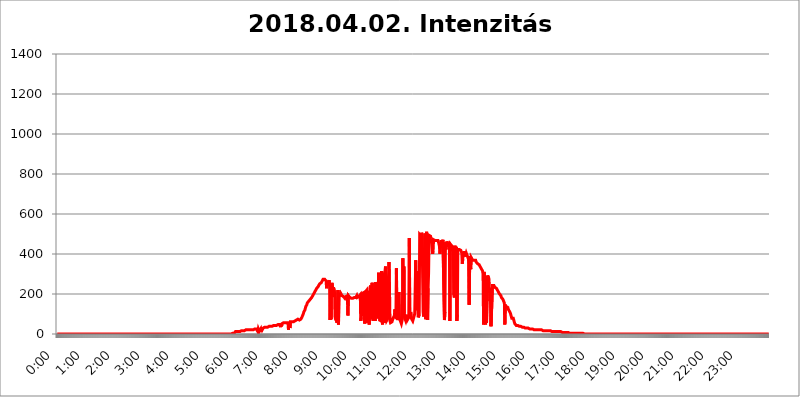
| Category | 2018.04.02. Intenzitás [W/m^2] |
|---|---|
| 0.0 | 0 |
| 0.0006944444444444445 | 0 |
| 0.001388888888888889 | 0 |
| 0.0020833333333333333 | 0 |
| 0.002777777777777778 | 0 |
| 0.003472222222222222 | 0 |
| 0.004166666666666667 | 0 |
| 0.004861111111111111 | 0 |
| 0.005555555555555556 | 0 |
| 0.0062499999999999995 | 0 |
| 0.006944444444444444 | 0 |
| 0.007638888888888889 | 0 |
| 0.008333333333333333 | 0 |
| 0.009027777777777779 | 0 |
| 0.009722222222222222 | 0 |
| 0.010416666666666666 | 0 |
| 0.011111111111111112 | 0 |
| 0.011805555555555555 | 0 |
| 0.012499999999999999 | 0 |
| 0.013194444444444444 | 0 |
| 0.013888888888888888 | 0 |
| 0.014583333333333332 | 0 |
| 0.015277777777777777 | 0 |
| 0.015972222222222224 | 0 |
| 0.016666666666666666 | 0 |
| 0.017361111111111112 | 0 |
| 0.018055555555555557 | 0 |
| 0.01875 | 0 |
| 0.019444444444444445 | 0 |
| 0.02013888888888889 | 0 |
| 0.020833333333333332 | 0 |
| 0.02152777777777778 | 0 |
| 0.022222222222222223 | 0 |
| 0.02291666666666667 | 0 |
| 0.02361111111111111 | 0 |
| 0.024305555555555556 | 0 |
| 0.024999999999999998 | 0 |
| 0.025694444444444447 | 0 |
| 0.02638888888888889 | 0 |
| 0.027083333333333334 | 0 |
| 0.027777777777777776 | 0 |
| 0.02847222222222222 | 0 |
| 0.029166666666666664 | 0 |
| 0.029861111111111113 | 0 |
| 0.030555555555555555 | 0 |
| 0.03125 | 0 |
| 0.03194444444444445 | 0 |
| 0.03263888888888889 | 0 |
| 0.03333333333333333 | 0 |
| 0.034027777777777775 | 0 |
| 0.034722222222222224 | 0 |
| 0.035416666666666666 | 0 |
| 0.036111111111111115 | 0 |
| 0.03680555555555556 | 0 |
| 0.0375 | 0 |
| 0.03819444444444444 | 0 |
| 0.03888888888888889 | 0 |
| 0.03958333333333333 | 0 |
| 0.04027777777777778 | 0 |
| 0.04097222222222222 | 0 |
| 0.041666666666666664 | 0 |
| 0.042361111111111106 | 0 |
| 0.04305555555555556 | 0 |
| 0.043750000000000004 | 0 |
| 0.044444444444444446 | 0 |
| 0.04513888888888889 | 0 |
| 0.04583333333333334 | 0 |
| 0.04652777777777778 | 0 |
| 0.04722222222222222 | 0 |
| 0.04791666666666666 | 0 |
| 0.04861111111111111 | 0 |
| 0.049305555555555554 | 0 |
| 0.049999999999999996 | 0 |
| 0.05069444444444445 | 0 |
| 0.051388888888888894 | 0 |
| 0.052083333333333336 | 0 |
| 0.05277777777777778 | 0 |
| 0.05347222222222222 | 0 |
| 0.05416666666666667 | 0 |
| 0.05486111111111111 | 0 |
| 0.05555555555555555 | 0 |
| 0.05625 | 0 |
| 0.05694444444444444 | 0 |
| 0.057638888888888885 | 0 |
| 0.05833333333333333 | 0 |
| 0.05902777777777778 | 0 |
| 0.059722222222222225 | 0 |
| 0.06041666666666667 | 0 |
| 0.061111111111111116 | 0 |
| 0.06180555555555556 | 0 |
| 0.0625 | 0 |
| 0.06319444444444444 | 0 |
| 0.06388888888888888 | 0 |
| 0.06458333333333334 | 0 |
| 0.06527777777777778 | 0 |
| 0.06597222222222222 | 0 |
| 0.06666666666666667 | 0 |
| 0.06736111111111111 | 0 |
| 0.06805555555555555 | 0 |
| 0.06874999999999999 | 0 |
| 0.06944444444444443 | 0 |
| 0.07013888888888889 | 0 |
| 0.07083333333333333 | 0 |
| 0.07152777777777779 | 0 |
| 0.07222222222222223 | 0 |
| 0.07291666666666667 | 0 |
| 0.07361111111111111 | 0 |
| 0.07430555555555556 | 0 |
| 0.075 | 0 |
| 0.07569444444444444 | 0 |
| 0.0763888888888889 | 0 |
| 0.07708333333333334 | 0 |
| 0.07777777777777778 | 0 |
| 0.07847222222222222 | 0 |
| 0.07916666666666666 | 0 |
| 0.0798611111111111 | 0 |
| 0.08055555555555556 | 0 |
| 0.08125 | 0 |
| 0.08194444444444444 | 0 |
| 0.08263888888888889 | 0 |
| 0.08333333333333333 | 0 |
| 0.08402777777777777 | 0 |
| 0.08472222222222221 | 0 |
| 0.08541666666666665 | 0 |
| 0.08611111111111112 | 0 |
| 0.08680555555555557 | 0 |
| 0.08750000000000001 | 0 |
| 0.08819444444444445 | 0 |
| 0.08888888888888889 | 0 |
| 0.08958333333333333 | 0 |
| 0.09027777777777778 | 0 |
| 0.09097222222222222 | 0 |
| 0.09166666666666667 | 0 |
| 0.09236111111111112 | 0 |
| 0.09305555555555556 | 0 |
| 0.09375 | 0 |
| 0.09444444444444444 | 0 |
| 0.09513888888888888 | 0 |
| 0.09583333333333333 | 0 |
| 0.09652777777777777 | 0 |
| 0.09722222222222222 | 0 |
| 0.09791666666666667 | 0 |
| 0.09861111111111111 | 0 |
| 0.09930555555555555 | 0 |
| 0.09999999999999999 | 0 |
| 0.10069444444444443 | 0 |
| 0.1013888888888889 | 0 |
| 0.10208333333333335 | 0 |
| 0.10277777777777779 | 0 |
| 0.10347222222222223 | 0 |
| 0.10416666666666667 | 0 |
| 0.10486111111111111 | 0 |
| 0.10555555555555556 | 0 |
| 0.10625 | 0 |
| 0.10694444444444444 | 0 |
| 0.1076388888888889 | 0 |
| 0.10833333333333334 | 0 |
| 0.10902777777777778 | 0 |
| 0.10972222222222222 | 0 |
| 0.1111111111111111 | 0 |
| 0.11180555555555556 | 0 |
| 0.11180555555555556 | 0 |
| 0.1125 | 0 |
| 0.11319444444444444 | 0 |
| 0.11388888888888889 | 0 |
| 0.11458333333333333 | 0 |
| 0.11527777777777777 | 0 |
| 0.11597222222222221 | 0 |
| 0.11666666666666665 | 0 |
| 0.1173611111111111 | 0 |
| 0.11805555555555557 | 0 |
| 0.11944444444444445 | 0 |
| 0.12013888888888889 | 0 |
| 0.12083333333333333 | 0 |
| 0.12152777777777778 | 0 |
| 0.12222222222222223 | 0 |
| 0.12291666666666667 | 0 |
| 0.12291666666666667 | 0 |
| 0.12361111111111112 | 0 |
| 0.12430555555555556 | 0 |
| 0.125 | 0 |
| 0.12569444444444444 | 0 |
| 0.12638888888888888 | 0 |
| 0.12708333333333333 | 0 |
| 0.16875 | 0 |
| 0.12847222222222224 | 0 |
| 0.12916666666666668 | 0 |
| 0.12986111111111112 | 0 |
| 0.13055555555555556 | 0 |
| 0.13125 | 0 |
| 0.13194444444444445 | 0 |
| 0.1326388888888889 | 0 |
| 0.13333333333333333 | 0 |
| 0.13402777777777777 | 0 |
| 0.13402777777777777 | 0 |
| 0.13472222222222222 | 0 |
| 0.13541666666666666 | 0 |
| 0.1361111111111111 | 0 |
| 0.13749999999999998 | 0 |
| 0.13819444444444443 | 0 |
| 0.1388888888888889 | 0 |
| 0.13958333333333334 | 0 |
| 0.14027777777777778 | 0 |
| 0.14097222222222222 | 0 |
| 0.14166666666666666 | 0 |
| 0.1423611111111111 | 0 |
| 0.14305555555555557 | 0 |
| 0.14375000000000002 | 0 |
| 0.14444444444444446 | 0 |
| 0.1451388888888889 | 0 |
| 0.1451388888888889 | 0 |
| 0.14652777777777778 | 0 |
| 0.14722222222222223 | 0 |
| 0.14791666666666667 | 0 |
| 0.1486111111111111 | 0 |
| 0.14930555555555555 | 0 |
| 0.15 | 0 |
| 0.15069444444444444 | 0 |
| 0.15138888888888888 | 0 |
| 0.15208333333333332 | 0 |
| 0.15277777777777776 | 0 |
| 0.15347222222222223 | 0 |
| 0.15416666666666667 | 0 |
| 0.15486111111111112 | 0 |
| 0.15555555555555556 | 0 |
| 0.15625 | 0 |
| 0.15694444444444444 | 0 |
| 0.15763888888888888 | 0 |
| 0.15833333333333333 | 0 |
| 0.15902777777777777 | 0 |
| 0.15972222222222224 | 0 |
| 0.16041666666666668 | 0 |
| 0.16111111111111112 | 0 |
| 0.16180555555555556 | 0 |
| 0.1625 | 0 |
| 0.16319444444444445 | 0 |
| 0.1638888888888889 | 0 |
| 0.16458333333333333 | 0 |
| 0.16527777777777777 | 0 |
| 0.16597222222222222 | 0 |
| 0.16666666666666666 | 0 |
| 0.1673611111111111 | 0 |
| 0.16805555555555554 | 0 |
| 0.16874999999999998 | 0 |
| 0.16944444444444443 | 0 |
| 0.17013888888888887 | 0 |
| 0.1708333333333333 | 0 |
| 0.17152777777777775 | 0 |
| 0.17222222222222225 | 0 |
| 0.1729166666666667 | 0 |
| 0.17361111111111113 | 0 |
| 0.17430555555555557 | 0 |
| 0.17500000000000002 | 0 |
| 0.17569444444444446 | 0 |
| 0.1763888888888889 | 0 |
| 0.17708333333333334 | 0 |
| 0.17777777777777778 | 0 |
| 0.17847222222222223 | 0 |
| 0.17916666666666667 | 0 |
| 0.1798611111111111 | 0 |
| 0.18055555555555555 | 0 |
| 0.18125 | 0 |
| 0.18194444444444444 | 0 |
| 0.1826388888888889 | 0 |
| 0.18333333333333335 | 0 |
| 0.1840277777777778 | 0 |
| 0.18472222222222223 | 0 |
| 0.18541666666666667 | 0 |
| 0.18611111111111112 | 0 |
| 0.18680555555555556 | 0 |
| 0.1875 | 0 |
| 0.18819444444444444 | 0 |
| 0.18888888888888888 | 0 |
| 0.18958333333333333 | 0 |
| 0.19027777777777777 | 0 |
| 0.1909722222222222 | 0 |
| 0.19166666666666665 | 0 |
| 0.19236111111111112 | 0 |
| 0.19305555555555554 | 0 |
| 0.19375 | 0 |
| 0.19444444444444445 | 0 |
| 0.1951388888888889 | 0 |
| 0.19583333333333333 | 0 |
| 0.19652777777777777 | 0 |
| 0.19722222222222222 | 0 |
| 0.19791666666666666 | 0 |
| 0.1986111111111111 | 0 |
| 0.19930555555555554 | 0 |
| 0.19999999999999998 | 0 |
| 0.20069444444444443 | 0 |
| 0.20138888888888887 | 0 |
| 0.2020833333333333 | 0 |
| 0.2027777777777778 | 0 |
| 0.2034722222222222 | 0 |
| 0.2041666666666667 | 0 |
| 0.20486111111111113 | 0 |
| 0.20555555555555557 | 0 |
| 0.20625000000000002 | 0 |
| 0.20694444444444446 | 0 |
| 0.2076388888888889 | 0 |
| 0.20833333333333334 | 0 |
| 0.20902777777777778 | 0 |
| 0.20972222222222223 | 0 |
| 0.21041666666666667 | 0 |
| 0.2111111111111111 | 0 |
| 0.21180555555555555 | 0 |
| 0.2125 | 0 |
| 0.21319444444444444 | 0 |
| 0.2138888888888889 | 0 |
| 0.21458333333333335 | 0 |
| 0.2152777777777778 | 0 |
| 0.21597222222222223 | 0 |
| 0.21666666666666667 | 0 |
| 0.21736111111111112 | 0 |
| 0.21805555555555556 | 0 |
| 0.21875 | 0 |
| 0.21944444444444444 | 0 |
| 0.22013888888888888 | 0 |
| 0.22083333333333333 | 0 |
| 0.22152777777777777 | 0 |
| 0.2222222222222222 | 0 |
| 0.22291666666666665 | 0 |
| 0.2236111111111111 | 0 |
| 0.22430555555555556 | 0 |
| 0.225 | 0 |
| 0.22569444444444445 | 0 |
| 0.2263888888888889 | 0 |
| 0.22708333333333333 | 0 |
| 0.22777777777777777 | 0 |
| 0.22847222222222222 | 0 |
| 0.22916666666666666 | 0 |
| 0.2298611111111111 | 0 |
| 0.23055555555555554 | 0 |
| 0.23124999999999998 | 0 |
| 0.23194444444444443 | 0 |
| 0.23263888888888887 | 0 |
| 0.2333333333333333 | 0 |
| 0.2340277777777778 | 0 |
| 0.2347222222222222 | 0 |
| 0.2354166666666667 | 0 |
| 0.23611111111111113 | 0 |
| 0.23680555555555557 | 0 |
| 0.23750000000000002 | 0 |
| 0.23819444444444446 | 0 |
| 0.2388888888888889 | 0 |
| 0.23958333333333334 | 0 |
| 0.24027777777777778 | 0 |
| 0.24097222222222223 | 0 |
| 0.24166666666666667 | 0 |
| 0.2423611111111111 | 0 |
| 0.24305555555555555 | 0 |
| 0.24375 | 0 |
| 0.24444444444444446 | 0 |
| 0.24513888888888888 | 3.525 |
| 0.24583333333333335 | 3.525 |
| 0.2465277777777778 | 3.525 |
| 0.24722222222222223 | 3.525 |
| 0.24791666666666667 | 3.525 |
| 0.24861111111111112 | 3.525 |
| 0.24930555555555556 | 7.887 |
| 0.25 | 12.257 |
| 0.25069444444444444 | 12.257 |
| 0.2513888888888889 | 12.257 |
| 0.2520833333333333 | 12.257 |
| 0.25277777777777777 | 12.257 |
| 0.2534722222222222 | 12.257 |
| 0.25416666666666665 | 12.257 |
| 0.2548611111111111 | 7.887 |
| 0.2555555555555556 | 16.636 |
| 0.25625000000000003 | 12.257 |
| 0.2569444444444445 | 16.636 |
| 0.2576388888888889 | 12.257 |
| 0.25833333333333336 | 16.636 |
| 0.2590277777777778 | 16.636 |
| 0.25972222222222224 | 16.636 |
| 0.2604166666666667 | 16.636 |
| 0.2611111111111111 | 16.636 |
| 0.26180555555555557 | 16.636 |
| 0.2625 | 16.636 |
| 0.26319444444444445 | 16.636 |
| 0.2638888888888889 | 16.636 |
| 0.26458333333333334 | 21.024 |
| 0.2652777777777778 | 21.024 |
| 0.2659722222222222 | 21.024 |
| 0.26666666666666666 | 21.024 |
| 0.2673611111111111 | 21.024 |
| 0.26805555555555555 | 21.024 |
| 0.26875 | 21.024 |
| 0.26944444444444443 | 21.024 |
| 0.2701388888888889 | 21.024 |
| 0.2708333333333333 | 21.024 |
| 0.27152777777777776 | 21.024 |
| 0.2722222222222222 | 21.024 |
| 0.27291666666666664 | 21.024 |
| 0.2736111111111111 | 21.024 |
| 0.2743055555555555 | 21.024 |
| 0.27499999999999997 | 21.024 |
| 0.27569444444444446 | 25.419 |
| 0.27638888888888885 | 25.419 |
| 0.27708333333333335 | 25.419 |
| 0.2777777777777778 | 25.419 |
| 0.27847222222222223 | 25.419 |
| 0.2791666666666667 | 25.419 |
| 0.2798611111111111 | 25.419 |
| 0.28055555555555556 | 25.419 |
| 0.28125 | 12.257 |
| 0.28194444444444444 | 25.419 |
| 0.2826388888888889 | 21.024 |
| 0.2833333333333333 | 12.257 |
| 0.28402777777777777 | 12.257 |
| 0.2847222222222222 | 16.636 |
| 0.28541666666666665 | 25.419 |
| 0.28611111111111115 | 12.257 |
| 0.28680555555555554 | 29.823 |
| 0.28750000000000003 | 21.024 |
| 0.2881944444444445 | 16.636 |
| 0.2888888888888889 | 29.823 |
| 0.28958333333333336 | 29.823 |
| 0.2902777777777778 | 29.823 |
| 0.29097222222222224 | 34.234 |
| 0.2916666666666667 | 34.234 |
| 0.2923611111111111 | 34.234 |
| 0.29305555555555557 | 34.234 |
| 0.29375 | 34.234 |
| 0.29444444444444445 | 34.234 |
| 0.2951388888888889 | 34.234 |
| 0.29583333333333334 | 34.234 |
| 0.2965277777777778 | 38.653 |
| 0.2972222222222222 | 38.653 |
| 0.29791666666666666 | 38.653 |
| 0.2986111111111111 | 38.653 |
| 0.29930555555555555 | 38.653 |
| 0.3 | 38.653 |
| 0.30069444444444443 | 34.234 |
| 0.3013888888888889 | 38.653 |
| 0.3020833333333333 | 38.653 |
| 0.30277777777777776 | 43.079 |
| 0.3034722222222222 | 43.079 |
| 0.30416666666666664 | 43.079 |
| 0.3048611111111111 | 43.079 |
| 0.3055555555555555 | 43.079 |
| 0.30624999999999997 | 43.079 |
| 0.3069444444444444 | 43.079 |
| 0.3076388888888889 | 43.079 |
| 0.30833333333333335 | 47.511 |
| 0.3090277777777778 | 47.511 |
| 0.30972222222222223 | 47.511 |
| 0.3104166666666667 | 47.511 |
| 0.3111111111111111 | 47.511 |
| 0.31180555555555556 | 47.511 |
| 0.3125 | 47.511 |
| 0.31319444444444444 | 34.234 |
| 0.3138888888888889 | 51.951 |
| 0.3145833333333333 | 38.653 |
| 0.31527777777777777 | 51.951 |
| 0.3159722222222222 | 51.951 |
| 0.31666666666666665 | 51.951 |
| 0.31736111111111115 | 56.398 |
| 0.31805555555555554 | 56.398 |
| 0.31875000000000003 | 56.398 |
| 0.3194444444444445 | 56.398 |
| 0.3201388888888889 | 56.398 |
| 0.32083333333333336 | 56.398 |
| 0.3215277777777778 | 56.398 |
| 0.32222222222222224 | 56.398 |
| 0.3229166666666667 | 56.398 |
| 0.3236111111111111 | 56.398 |
| 0.32430555555555557 | 21.024 |
| 0.325 | 56.398 |
| 0.32569444444444445 | 56.398 |
| 0.3263888888888889 | 29.823 |
| 0.32708333333333334 | 60.85 |
| 0.3277777777777778 | 60.85 |
| 0.3284722222222222 | 60.85 |
| 0.32916666666666666 | 60.85 |
| 0.3298611111111111 | 65.31 |
| 0.33055555555555555 | 65.31 |
| 0.33125 | 60.85 |
| 0.33194444444444443 | 60.85 |
| 0.3326388888888889 | 65.31 |
| 0.3333333333333333 | 65.31 |
| 0.3340277777777778 | 65.31 |
| 0.3347222222222222 | 69.775 |
| 0.3354166666666667 | 69.775 |
| 0.3361111111111111 | 69.775 |
| 0.3368055555555556 | 69.775 |
| 0.33749999999999997 | 74.246 |
| 0.33819444444444446 | 74.246 |
| 0.33888888888888885 | 69.775 |
| 0.33958333333333335 | 69.775 |
| 0.34027777777777773 | 69.775 |
| 0.34097222222222223 | 74.246 |
| 0.3416666666666666 | 74.246 |
| 0.3423611111111111 | 78.722 |
| 0.3430555555555555 | 83.205 |
| 0.34375 | 87.692 |
| 0.3444444444444445 | 83.205 |
| 0.3451388888888889 | 101.184 |
| 0.3458333333333334 | 110.201 |
| 0.34652777777777777 | 114.716 |
| 0.34722222222222227 | 119.235 |
| 0.34791666666666665 | 128.284 |
| 0.34861111111111115 | 137.347 |
| 0.34930555555555554 | 141.884 |
| 0.35000000000000003 | 146.423 |
| 0.3506944444444444 | 155.509 |
| 0.3513888888888889 | 155.509 |
| 0.3520833333333333 | 160.056 |
| 0.3527777777777778 | 164.605 |
| 0.3534722222222222 | 164.605 |
| 0.3541666666666667 | 169.156 |
| 0.3548611111111111 | 173.709 |
| 0.35555555555555557 | 173.709 |
| 0.35625 | 178.264 |
| 0.35694444444444445 | 182.82 |
| 0.3576388888888889 | 187.378 |
| 0.35833333333333334 | 191.937 |
| 0.3590277777777778 | 196.497 |
| 0.3597222222222222 | 201.058 |
| 0.36041666666666666 | 201.058 |
| 0.3611111111111111 | 210.182 |
| 0.36180555555555555 | 214.746 |
| 0.3625 | 219.309 |
| 0.36319444444444443 | 219.309 |
| 0.3638888888888889 | 228.436 |
| 0.3645833333333333 | 233 |
| 0.3652777777777778 | 228.436 |
| 0.3659722222222222 | 237.564 |
| 0.3666666666666667 | 242.127 |
| 0.3673611111111111 | 242.127 |
| 0.3680555555555556 | 251.251 |
| 0.36874999999999997 | 251.251 |
| 0.36944444444444446 | 246.689 |
| 0.37013888888888885 | 255.813 |
| 0.37083333333333335 | 260.373 |
| 0.37152777777777773 | 264.932 |
| 0.37222222222222223 | 269.49 |
| 0.3729166666666666 | 274.047 |
| 0.3736111111111111 | 274.047 |
| 0.3743055555555555 | 269.49 |
| 0.375 | 274.047 |
| 0.3756944444444445 | 278.603 |
| 0.3763888888888889 | 278.603 |
| 0.3770833333333334 | 264.932 |
| 0.37777777777777777 | 228.436 |
| 0.37847222222222227 | 260.373 |
| 0.37916666666666665 | 255.813 |
| 0.37986111111111115 | 260.373 |
| 0.38055555555555554 | 260.373 |
| 0.38125000000000003 | 269.49 |
| 0.3819444444444444 | 242.127 |
| 0.3826388888888889 | 69.775 |
| 0.3833333333333333 | 242.127 |
| 0.3840277777777778 | 74.246 |
| 0.3847222222222222 | 246.689 |
| 0.3854166666666667 | 255.813 |
| 0.3861111111111111 | 233 |
| 0.38680555555555557 | 210.182 |
| 0.3875 | 233 |
| 0.38819444444444445 | 237.564 |
| 0.3888888888888889 | 210.182 |
| 0.38958333333333334 | 87.692 |
| 0.3902777777777778 | 74.246 |
| 0.3909722222222222 | 74.246 |
| 0.39166666666666666 | 65.31 |
| 0.3923611111111111 | 56.398 |
| 0.39305555555555555 | 60.85 |
| 0.39375 | 219.309 |
| 0.39444444444444443 | 47.511 |
| 0.3951388888888889 | 205.62 |
| 0.3958333333333333 | 201.058 |
| 0.3965277777777778 | 196.497 |
| 0.3972222222222222 | 187.378 |
| 0.3979166666666667 | 201.058 |
| 0.3986111111111111 | 196.497 |
| 0.3993055555555556 | 191.937 |
| 0.39999999999999997 | 191.937 |
| 0.40069444444444446 | 187.378 |
| 0.40138888888888885 | 187.378 |
| 0.40208333333333335 | 182.82 |
| 0.40277777777777773 | 187.378 |
| 0.40347222222222223 | 178.264 |
| 0.4041666666666666 | 182.82 |
| 0.4048611111111111 | 187.378 |
| 0.4055555555555555 | 187.378 |
| 0.40625 | 182.82 |
| 0.4069444444444445 | 191.937 |
| 0.4076388888888889 | 92.184 |
| 0.4083333333333334 | 191.937 |
| 0.40902777777777777 | 187.378 |
| 0.40972222222222227 | 187.378 |
| 0.41041666666666665 | 182.82 |
| 0.41111111111111115 | 182.82 |
| 0.41180555555555554 | 182.82 |
| 0.41250000000000003 | 178.264 |
| 0.4131944444444444 | 178.264 |
| 0.4138888888888889 | 173.709 |
| 0.4145833333333333 | 178.264 |
| 0.4152777777777778 | 173.709 |
| 0.4159722222222222 | 178.264 |
| 0.4166666666666667 | 182.82 |
| 0.4173611111111111 | 187.378 |
| 0.41805555555555557 | 182.82 |
| 0.41875 | 182.82 |
| 0.41944444444444445 | 187.378 |
| 0.4201388888888889 | 191.937 |
| 0.42083333333333334 | 182.82 |
| 0.4215277777777778 | 187.378 |
| 0.4222222222222222 | 187.378 |
| 0.42291666666666666 | 187.378 |
| 0.4236111111111111 | 191.937 |
| 0.42430555555555555 | 191.937 |
| 0.425 | 196.497 |
| 0.42569444444444443 | 65.31 |
| 0.4263888888888889 | 83.205 |
| 0.4270833333333333 | 201.058 |
| 0.4277777777777778 | 205.62 |
| 0.4284722222222222 | 205.62 |
| 0.4291666666666667 | 205.62 |
| 0.4298611111111111 | 205.62 |
| 0.4305555555555556 | 210.182 |
| 0.43124999999999997 | 51.951 |
| 0.43194444444444446 | 210.182 |
| 0.43263888888888885 | 210.182 |
| 0.43333333333333335 | 214.746 |
| 0.43402777777777773 | 219.309 |
| 0.43472222222222223 | 56.398 |
| 0.4354166666666666 | 214.746 |
| 0.4361111111111111 | 65.31 |
| 0.4368055555555555 | 169.156 |
| 0.4375 | 47.511 |
| 0.4381944444444445 | 210.182 |
| 0.4388888888888889 | 233 |
| 0.4395833333333334 | 242.127 |
| 0.44027777777777777 | 242.127 |
| 0.44097222222222227 | 74.246 |
| 0.44166666666666665 | 255.813 |
| 0.44236111111111115 | 182.82 |
| 0.44305555555555554 | 65.31 |
| 0.44375000000000003 | 65.31 |
| 0.4444444444444444 | 60.85 |
| 0.4451388888888889 | 228.436 |
| 0.4458333333333333 | 65.31 |
| 0.4465277777777778 | 260.373 |
| 0.4472222222222222 | 205.62 |
| 0.4479166666666667 | 87.692 |
| 0.4486111111111111 | 78.722 |
| 0.44930555555555557 | 110.201 |
| 0.45 | 78.722 |
| 0.45069444444444445 | 305.898 |
| 0.4513888888888889 | 164.605 |
| 0.45208333333333334 | 69.775 |
| 0.4527777777777778 | 65.31 |
| 0.4534722222222222 | 74.246 |
| 0.45416666666666666 | 65.31 |
| 0.4548611111111111 | 314.98 |
| 0.45555555555555555 | 65.31 |
| 0.45625 | 47.511 |
| 0.45694444444444443 | 305.898 |
| 0.4576388888888889 | 169.156 |
| 0.4583333333333333 | 173.709 |
| 0.4590277777777778 | 56.398 |
| 0.4597222222222222 | 314.98 |
| 0.4604166666666667 | 337.639 |
| 0.4611111111111111 | 78.722 |
| 0.4618055555555556 | 65.31 |
| 0.46249999999999997 | 60.85 |
| 0.46319444444444446 | 74.246 |
| 0.46388888888888885 | 74.246 |
| 0.46458333333333335 | 74.246 |
| 0.46527777777777773 | 360.221 |
| 0.46597222222222223 | 233 |
| 0.4666666666666666 | 65.31 |
| 0.4673611111111111 | 56.398 |
| 0.4680555555555555 | 60.85 |
| 0.46875 | 60.85 |
| 0.4694444444444445 | 60.85 |
| 0.4701388888888889 | 65.31 |
| 0.4708333333333334 | 65.31 |
| 0.47152777777777777 | 83.205 |
| 0.47222222222222227 | 83.205 |
| 0.47291666666666665 | 92.184 |
| 0.47361111111111115 | 123.758 |
| 0.47430555555555554 | 78.722 |
| 0.47500000000000003 | 92.184 |
| 0.4756944444444444 | 328.584 |
| 0.4763888888888889 | 74.246 |
| 0.4770833333333333 | 83.205 |
| 0.4777777777777778 | 69.775 |
| 0.4784722222222222 | 83.205 |
| 0.4791666666666667 | 210.182 |
| 0.4798611111111111 | 78.722 |
| 0.48055555555555557 | 74.246 |
| 0.48125 | 65.31 |
| 0.48194444444444445 | 60.85 |
| 0.4826388888888889 | 51.951 |
| 0.48333333333333334 | 51.951 |
| 0.4840277777777778 | 74.246 |
| 0.4847222222222222 | 378.224 |
| 0.48541666666666666 | 83.205 |
| 0.4861111111111111 | 337.639 |
| 0.48680555555555555 | 101.184 |
| 0.4875 | 78.722 |
| 0.48819444444444443 | 74.246 |
| 0.4888888888888889 | 65.31 |
| 0.4895833333333333 | 65.31 |
| 0.4902777777777778 | 83.205 |
| 0.4909722222222222 | 96.682 |
| 0.4916666666666667 | 74.246 |
| 0.4923611111111111 | 69.775 |
| 0.4930555555555556 | 83.205 |
| 0.49374999999999997 | 480.356 |
| 0.49444444444444446 | 87.692 |
| 0.49513888888888885 | 92.184 |
| 0.49583333333333335 | 110.201 |
| 0.49652777777777773 | 78.722 |
| 0.49722222222222223 | 74.246 |
| 0.4979166666666666 | 69.775 |
| 0.4986111111111111 | 83.205 |
| 0.4993055555555555 | 74.246 |
| 0.5 | 74.246 |
| 0.5006944444444444 | 74.246 |
| 0.5013888888888889 | 101.184 |
| 0.5020833333333333 | 101.184 |
| 0.5027777777777778 | 369.23 |
| 0.5034722222222222 | 128.284 |
| 0.5041666666666667 | 119.235 |
| 0.5048611111111111 | 314.98 |
| 0.5055555555555555 | 141.884 |
| 0.50625 | 83.205 |
| 0.5069444444444444 | 87.692 |
| 0.5076388888888889 | 96.682 |
| 0.5083333333333333 | 497.836 |
| 0.5090277777777777 | 493.475 |
| 0.5097222222222222 | 502.192 |
| 0.5104166666666666 | 489.108 |
| 0.5111111111111112 | 506.542 |
| 0.5118055555555555 | 493.475 |
| 0.5125000000000001 | 278.603 |
| 0.5131944444444444 | 110.201 |
| 0.513888888888889 | 87.692 |
| 0.5145833333333333 | 283.156 |
| 0.5152777777777778 | 484.735 |
| 0.5159722222222222 | 502.192 |
| 0.5166666666666667 | 74.246 |
| 0.517361111111111 | 101.184 |
| 0.5180555555555556 | 510.885 |
| 0.5187499999999999 | 251.251 |
| 0.5194444444444445 | 69.775 |
| 0.5201388888888888 | 228.436 |
| 0.5208333333333334 | 305.898 |
| 0.5215277777777778 | 493.475 |
| 0.5222222222222223 | 493.475 |
| 0.5229166666666667 | 497.836 |
| 0.5236111111111111 | 489.108 |
| 0.5243055555555556 | 475.972 |
| 0.525 | 467.187 |
| 0.5256944444444445 | 453.968 |
| 0.5263888888888889 | 400.638 |
| 0.5270833333333333 | 414.035 |
| 0.5277777777777778 | 471.582 |
| 0.5284722222222222 | 475.972 |
| 0.5291666666666667 | 471.582 |
| 0.5298611111111111 | 467.187 |
| 0.5305555555555556 | 467.187 |
| 0.53125 | 471.582 |
| 0.5319444444444444 | 467.187 |
| 0.5326388888888889 | 467.187 |
| 0.5333333333333333 | 467.187 |
| 0.5340277777777778 | 467.187 |
| 0.5347222222222222 | 462.786 |
| 0.5354166666666667 | 449.551 |
| 0.5361111111111111 | 436.27 |
| 0.5368055555555555 | 400.638 |
| 0.5375 | 436.27 |
| 0.5381944444444444 | 462.786 |
| 0.5388888888888889 | 462.786 |
| 0.5395833333333333 | 462.786 |
| 0.5402777777777777 | 462.786 |
| 0.5409722222222222 | 471.582 |
| 0.5416666666666666 | 471.582 |
| 0.5423611111111112 | 475.972 |
| 0.5430555555555555 | 69.775 |
| 0.5437500000000001 | 110.201 |
| 0.5444444444444444 | 458.38 |
| 0.545138888888889 | 422.943 |
| 0.5458333333333333 | 449.551 |
| 0.5465277777777778 | 462.786 |
| 0.5472222222222222 | 458.38 |
| 0.5479166666666667 | 445.129 |
| 0.548611111111111 | 449.551 |
| 0.5493055555555556 | 449.551 |
| 0.5499999999999999 | 449.551 |
| 0.5506944444444445 | 65.31 |
| 0.5513888888888888 | 449.551 |
| 0.5520833333333334 | 445.129 |
| 0.5527777777777778 | 449.551 |
| 0.5534722222222223 | 440.702 |
| 0.5541666666666667 | 431.833 |
| 0.5548611111111111 | 436.27 |
| 0.5555555555555556 | 440.702 |
| 0.55625 | 196.497 |
| 0.5569444444444445 | 182.82 |
| 0.5576388888888889 | 440.702 |
| 0.5583333333333333 | 431.833 |
| 0.5590277777777778 | 422.943 |
| 0.5597222222222222 | 436.27 |
| 0.5604166666666667 | 65.31 |
| 0.5611111111111111 | 96.682 |
| 0.5618055555555556 | 422.943 |
| 0.5625 | 427.39 |
| 0.5631944444444444 | 422.943 |
| 0.5638888888888889 | 422.943 |
| 0.5645833333333333 | 422.943 |
| 0.5652777777777778 | 427.39 |
| 0.5659722222222222 | 418.492 |
| 0.5666666666666667 | 414.035 |
| 0.5673611111111111 | 405.108 |
| 0.5680555555555555 | 351.198 |
| 0.56875 | 373.729 |
| 0.5694444444444444 | 409.574 |
| 0.5701388888888889 | 396.164 |
| 0.5708333333333333 | 414.035 |
| 0.5715277777777777 | 409.574 |
| 0.5722222222222222 | 387.202 |
| 0.5729166666666666 | 396.164 |
| 0.5736111111111112 | 405.108 |
| 0.5743055555555555 | 400.638 |
| 0.5750000000000001 | 391.685 |
| 0.5756944444444444 | 396.164 |
| 0.576388888888889 | 378.224 |
| 0.5770833333333333 | 387.202 |
| 0.5777777777777778 | 146.423 |
| 0.5784722222222222 | 387.202 |
| 0.5791666666666667 | 391.685 |
| 0.579861111111111 | 324.052 |
| 0.5805555555555556 | 382.715 |
| 0.5812499999999999 | 378.224 |
| 0.5819444444444445 | 378.224 |
| 0.5826388888888888 | 369.23 |
| 0.5833333333333334 | 369.23 |
| 0.5840277777777778 | 369.23 |
| 0.5847222222222223 | 369.23 |
| 0.5854166666666667 | 373.729 |
| 0.5861111111111111 | 369.23 |
| 0.5868055555555556 | 369.23 |
| 0.5875 | 360.221 |
| 0.5881944444444445 | 360.221 |
| 0.5888888888888889 | 355.712 |
| 0.5895833333333333 | 351.198 |
| 0.5902777777777778 | 351.198 |
| 0.5909722222222222 | 351.198 |
| 0.5916666666666667 | 346.682 |
| 0.5923611111111111 | 342.162 |
| 0.5930555555555556 | 342.162 |
| 0.59375 | 333.113 |
| 0.5944444444444444 | 328.584 |
| 0.5951388888888889 | 324.052 |
| 0.5958333333333333 | 319.517 |
| 0.5965277777777778 | 314.98 |
| 0.5972222222222222 | 296.808 |
| 0.5979166666666667 | 47.511 |
| 0.5986111111111111 | 310.44 |
| 0.5993055555555555 | 305.898 |
| 0.6 | 255.813 |
| 0.6006944444444444 | 47.511 |
| 0.6013888888888889 | 219.309 |
| 0.6020833333333333 | 56.398 |
| 0.6027777777777777 | 60.85 |
| 0.6034722222222222 | 292.259 |
| 0.6041666666666666 | 287.709 |
| 0.6048611111111112 | 283.156 |
| 0.6055555555555555 | 274.047 |
| 0.6062500000000001 | 278.603 |
| 0.6069444444444444 | 164.605 |
| 0.607638888888889 | 210.182 |
| 0.6083333333333333 | 38.653 |
| 0.6090277777777778 | 34.234 |
| 0.6097222222222222 | 38.653 |
| 0.6104166666666667 | 242.127 |
| 0.611111111111111 | 242.127 |
| 0.6118055555555556 | 242.127 |
| 0.6124999999999999 | 242.127 |
| 0.6131944444444445 | 237.564 |
| 0.6138888888888888 | 233 |
| 0.6145833333333334 | 233 |
| 0.6152777777777778 | 233 |
| 0.6159722222222223 | 228.436 |
| 0.6166666666666667 | 223.873 |
| 0.6173611111111111 | 219.309 |
| 0.6180555555555556 | 214.746 |
| 0.61875 | 210.182 |
| 0.6194444444444445 | 205.62 |
| 0.6201388888888889 | 201.058 |
| 0.6208333333333333 | 201.058 |
| 0.6215277777777778 | 196.497 |
| 0.6222222222222222 | 191.937 |
| 0.6229166666666667 | 182.82 |
| 0.6236111111111111 | 182.82 |
| 0.6243055555555556 | 178.264 |
| 0.625 | 173.709 |
| 0.6256944444444444 | 169.156 |
| 0.6263888888888889 | 169.156 |
| 0.6270833333333333 | 155.509 |
| 0.6277777777777778 | 47.511 |
| 0.6284722222222222 | 146.423 |
| 0.6291666666666667 | 128.284 |
| 0.6298611111111111 | 137.347 |
| 0.6305555555555555 | 137.347 |
| 0.63125 | 137.347 |
| 0.6319444444444444 | 132.814 |
| 0.6326388888888889 | 123.758 |
| 0.6333333333333333 | 119.235 |
| 0.6340277777777777 | 114.716 |
| 0.6347222222222222 | 110.201 |
| 0.6354166666666666 | 105.69 |
| 0.6361111111111112 | 96.682 |
| 0.6368055555555555 | 87.692 |
| 0.6375000000000001 | 78.722 |
| 0.6381944444444444 | 83.205 |
| 0.638888888888889 | 83.205 |
| 0.6395833333333333 | 78.722 |
| 0.6402777777777778 | 74.246 |
| 0.6409722222222222 | 60.85 |
| 0.6416666666666667 | 51.951 |
| 0.642361111111111 | 47.511 |
| 0.6430555555555556 | 47.511 |
| 0.6437499999999999 | 43.079 |
| 0.6444444444444445 | 43.079 |
| 0.6451388888888888 | 43.079 |
| 0.6458333333333334 | 43.079 |
| 0.6465277777777778 | 43.079 |
| 0.6472222222222223 | 38.653 |
| 0.6479166666666667 | 38.653 |
| 0.6486111111111111 | 38.653 |
| 0.6493055555555556 | 38.653 |
| 0.65 | 38.653 |
| 0.6506944444444445 | 38.653 |
| 0.6513888888888889 | 34.234 |
| 0.6520833333333333 | 34.234 |
| 0.6527777777777778 | 34.234 |
| 0.6534722222222222 | 34.234 |
| 0.6541666666666667 | 34.234 |
| 0.6548611111111111 | 29.823 |
| 0.6555555555555556 | 29.823 |
| 0.65625 | 29.823 |
| 0.6569444444444444 | 29.823 |
| 0.6576388888888889 | 29.823 |
| 0.6583333333333333 | 29.823 |
| 0.6590277777777778 | 29.823 |
| 0.6597222222222222 | 29.823 |
| 0.6604166666666667 | 29.823 |
| 0.6611111111111111 | 25.419 |
| 0.6618055555555555 | 25.419 |
| 0.6625 | 25.419 |
| 0.6631944444444444 | 25.419 |
| 0.6638888888888889 | 25.419 |
| 0.6645833333333333 | 25.419 |
| 0.6652777777777777 | 25.419 |
| 0.6659722222222222 | 25.419 |
| 0.6666666666666666 | 25.419 |
| 0.6673611111111111 | 25.419 |
| 0.6680555555555556 | 25.419 |
| 0.6687500000000001 | 21.024 |
| 0.6694444444444444 | 21.024 |
| 0.6701388888888888 | 21.024 |
| 0.6708333333333334 | 21.024 |
| 0.6715277777777778 | 21.024 |
| 0.6722222222222222 | 21.024 |
| 0.6729166666666666 | 21.024 |
| 0.6736111111111112 | 21.024 |
| 0.6743055555555556 | 21.024 |
| 0.6749999999999999 | 21.024 |
| 0.6756944444444444 | 21.024 |
| 0.6763888888888889 | 21.024 |
| 0.6770833333333334 | 21.024 |
| 0.6777777777777777 | 21.024 |
| 0.6784722222222223 | 21.024 |
| 0.6791666666666667 | 21.024 |
| 0.6798611111111111 | 21.024 |
| 0.6805555555555555 | 21.024 |
| 0.68125 | 16.636 |
| 0.6819444444444445 | 21.024 |
| 0.6826388888888889 | 16.636 |
| 0.6833333333333332 | 16.636 |
| 0.6840277777777778 | 16.636 |
| 0.6847222222222222 | 16.636 |
| 0.6854166666666667 | 16.636 |
| 0.686111111111111 | 16.636 |
| 0.6868055555555556 | 16.636 |
| 0.6875 | 16.636 |
| 0.6881944444444444 | 16.636 |
| 0.688888888888889 | 16.636 |
| 0.6895833333333333 | 16.636 |
| 0.6902777777777778 | 16.636 |
| 0.6909722222222222 | 16.636 |
| 0.6916666666666668 | 16.636 |
| 0.6923611111111111 | 16.636 |
| 0.6930555555555555 | 16.636 |
| 0.69375 | 12.257 |
| 0.6944444444444445 | 12.257 |
| 0.6951388888888889 | 12.257 |
| 0.6958333333333333 | 12.257 |
| 0.6965277777777777 | 12.257 |
| 0.6972222222222223 | 12.257 |
| 0.6979166666666666 | 12.257 |
| 0.6986111111111111 | 12.257 |
| 0.6993055555555556 | 12.257 |
| 0.7000000000000001 | 12.257 |
| 0.7006944444444444 | 12.257 |
| 0.7013888888888888 | 12.257 |
| 0.7020833333333334 | 12.257 |
| 0.7027777777777778 | 12.257 |
| 0.7034722222222222 | 12.257 |
| 0.7041666666666666 | 12.257 |
| 0.7048611111111112 | 12.257 |
| 0.7055555555555556 | 12.257 |
| 0.7062499999999999 | 12.257 |
| 0.7069444444444444 | 12.257 |
| 0.7076388888888889 | 12.257 |
| 0.7083333333333334 | 7.887 |
| 0.7090277777777777 | 7.887 |
| 0.7097222222222223 | 7.887 |
| 0.7104166666666667 | 7.887 |
| 0.7111111111111111 | 7.887 |
| 0.7118055555555555 | 7.887 |
| 0.7125 | 7.887 |
| 0.7131944444444445 | 7.887 |
| 0.7138888888888889 | 7.887 |
| 0.7145833333333332 | 7.887 |
| 0.7152777777777778 | 7.887 |
| 0.7159722222222222 | 7.887 |
| 0.7166666666666667 | 7.887 |
| 0.717361111111111 | 3.525 |
| 0.7180555555555556 | 3.525 |
| 0.71875 | 3.525 |
| 0.7194444444444444 | 3.525 |
| 0.720138888888889 | 3.525 |
| 0.7208333333333333 | 3.525 |
| 0.7215277777777778 | 3.525 |
| 0.7222222222222222 | 3.525 |
| 0.7229166666666668 | 3.525 |
| 0.7236111111111111 | 3.525 |
| 0.7243055555555555 | 3.525 |
| 0.725 | 3.525 |
| 0.7256944444444445 | 3.525 |
| 0.7263888888888889 | 3.525 |
| 0.7270833333333333 | 3.525 |
| 0.7277777777777777 | 3.525 |
| 0.7284722222222223 | 3.525 |
| 0.7291666666666666 | 3.525 |
| 0.7298611111111111 | 3.525 |
| 0.7305555555555556 | 3.525 |
| 0.7312500000000001 | 3.525 |
| 0.7319444444444444 | 3.525 |
| 0.7326388888888888 | 3.525 |
| 0.7333333333333334 | 3.525 |
| 0.7340277777777778 | 3.525 |
| 0.7347222222222222 | 3.525 |
| 0.7354166666666666 | 3.525 |
| 0.7361111111111112 | 3.525 |
| 0.7368055555555556 | 0 |
| 0.7374999999999999 | 3.525 |
| 0.7381944444444444 | 0 |
| 0.7388888888888889 | 0 |
| 0.7395833333333334 | 0 |
| 0.7402777777777777 | 0 |
| 0.7409722222222223 | 0 |
| 0.7416666666666667 | 0 |
| 0.7423611111111111 | 0 |
| 0.7430555555555555 | 0 |
| 0.74375 | 0 |
| 0.7444444444444445 | 0 |
| 0.7451388888888889 | 0 |
| 0.7458333333333332 | 0 |
| 0.7465277777777778 | 0 |
| 0.7472222222222222 | 0 |
| 0.7479166666666667 | 0 |
| 0.748611111111111 | 0 |
| 0.7493055555555556 | 0 |
| 0.75 | 0 |
| 0.7506944444444444 | 0 |
| 0.751388888888889 | 0 |
| 0.7520833333333333 | 0 |
| 0.7527777777777778 | 0 |
| 0.7534722222222222 | 0 |
| 0.7541666666666668 | 0 |
| 0.7548611111111111 | 0 |
| 0.7555555555555555 | 0 |
| 0.75625 | 0 |
| 0.7569444444444445 | 0 |
| 0.7576388888888889 | 0 |
| 0.7583333333333333 | 0 |
| 0.7590277777777777 | 0 |
| 0.7597222222222223 | 0 |
| 0.7604166666666666 | 0 |
| 0.7611111111111111 | 0 |
| 0.7618055555555556 | 0 |
| 0.7625000000000001 | 0 |
| 0.7631944444444444 | 0 |
| 0.7638888888888888 | 0 |
| 0.7645833333333334 | 0 |
| 0.7652777777777778 | 0 |
| 0.7659722222222222 | 0 |
| 0.7666666666666666 | 0 |
| 0.7673611111111112 | 0 |
| 0.7680555555555556 | 0 |
| 0.7687499999999999 | 0 |
| 0.7694444444444444 | 0 |
| 0.7701388888888889 | 0 |
| 0.7708333333333334 | 0 |
| 0.7715277777777777 | 0 |
| 0.7722222222222223 | 0 |
| 0.7729166666666667 | 0 |
| 0.7736111111111111 | 0 |
| 0.7743055555555555 | 0 |
| 0.775 | 0 |
| 0.7756944444444445 | 0 |
| 0.7763888888888889 | 0 |
| 0.7770833333333332 | 0 |
| 0.7777777777777778 | 0 |
| 0.7784722222222222 | 0 |
| 0.7791666666666667 | 0 |
| 0.779861111111111 | 0 |
| 0.7805555555555556 | 0 |
| 0.78125 | 0 |
| 0.7819444444444444 | 0 |
| 0.782638888888889 | 0 |
| 0.7833333333333333 | 0 |
| 0.7840277777777778 | 0 |
| 0.7847222222222222 | 0 |
| 0.7854166666666668 | 0 |
| 0.7861111111111111 | 0 |
| 0.7868055555555555 | 0 |
| 0.7875 | 0 |
| 0.7881944444444445 | 0 |
| 0.7888888888888889 | 0 |
| 0.7895833333333333 | 0 |
| 0.7902777777777777 | 0 |
| 0.7909722222222223 | 0 |
| 0.7916666666666666 | 0 |
| 0.7923611111111111 | 0 |
| 0.7930555555555556 | 0 |
| 0.7937500000000001 | 0 |
| 0.7944444444444444 | 0 |
| 0.7951388888888888 | 0 |
| 0.7958333333333334 | 0 |
| 0.7965277777777778 | 0 |
| 0.7972222222222222 | 0 |
| 0.7979166666666666 | 0 |
| 0.7986111111111112 | 0 |
| 0.7993055555555556 | 0 |
| 0.7999999999999999 | 0 |
| 0.8006944444444444 | 0 |
| 0.8013888888888889 | 0 |
| 0.8020833333333334 | 0 |
| 0.8027777777777777 | 0 |
| 0.8034722222222223 | 0 |
| 0.8041666666666667 | 0 |
| 0.8048611111111111 | 0 |
| 0.8055555555555555 | 0 |
| 0.80625 | 0 |
| 0.8069444444444445 | 0 |
| 0.8076388888888889 | 0 |
| 0.8083333333333332 | 0 |
| 0.8090277777777778 | 0 |
| 0.8097222222222222 | 0 |
| 0.8104166666666667 | 0 |
| 0.811111111111111 | 0 |
| 0.8118055555555556 | 0 |
| 0.8125 | 0 |
| 0.8131944444444444 | 0 |
| 0.813888888888889 | 0 |
| 0.8145833333333333 | 0 |
| 0.8152777777777778 | 0 |
| 0.8159722222222222 | 0 |
| 0.8166666666666668 | 0 |
| 0.8173611111111111 | 0 |
| 0.8180555555555555 | 0 |
| 0.81875 | 0 |
| 0.8194444444444445 | 0 |
| 0.8201388888888889 | 0 |
| 0.8208333333333333 | 0 |
| 0.8215277777777777 | 0 |
| 0.8222222222222223 | 0 |
| 0.8229166666666666 | 0 |
| 0.8236111111111111 | 0 |
| 0.8243055555555556 | 0 |
| 0.8250000000000001 | 0 |
| 0.8256944444444444 | 0 |
| 0.8263888888888888 | 0 |
| 0.8270833333333334 | 0 |
| 0.8277777777777778 | 0 |
| 0.8284722222222222 | 0 |
| 0.8291666666666666 | 0 |
| 0.8298611111111112 | 0 |
| 0.8305555555555556 | 0 |
| 0.8312499999999999 | 0 |
| 0.8319444444444444 | 0 |
| 0.8326388888888889 | 0 |
| 0.8333333333333334 | 0 |
| 0.8340277777777777 | 0 |
| 0.8347222222222223 | 0 |
| 0.8354166666666667 | 0 |
| 0.8361111111111111 | 0 |
| 0.8368055555555555 | 0 |
| 0.8375 | 0 |
| 0.8381944444444445 | 0 |
| 0.8388888888888889 | 0 |
| 0.8395833333333332 | 0 |
| 0.8402777777777778 | 0 |
| 0.8409722222222222 | 0 |
| 0.8416666666666667 | 0 |
| 0.842361111111111 | 0 |
| 0.8430555555555556 | 0 |
| 0.84375 | 0 |
| 0.8444444444444444 | 0 |
| 0.845138888888889 | 0 |
| 0.8458333333333333 | 0 |
| 0.8465277777777778 | 0 |
| 0.8472222222222222 | 0 |
| 0.8479166666666668 | 0 |
| 0.8486111111111111 | 0 |
| 0.8493055555555555 | 0 |
| 0.85 | 0 |
| 0.8506944444444445 | 0 |
| 0.8513888888888889 | 0 |
| 0.8520833333333333 | 0 |
| 0.8527777777777777 | 0 |
| 0.8534722222222223 | 0 |
| 0.8541666666666666 | 0 |
| 0.8548611111111111 | 0 |
| 0.8555555555555556 | 0 |
| 0.8562500000000001 | 0 |
| 0.8569444444444444 | 0 |
| 0.8576388888888888 | 0 |
| 0.8583333333333334 | 0 |
| 0.8590277777777778 | 0 |
| 0.8597222222222222 | 0 |
| 0.8604166666666666 | 0 |
| 0.8611111111111112 | 0 |
| 0.8618055555555556 | 0 |
| 0.8624999999999999 | 0 |
| 0.8631944444444444 | 0 |
| 0.8638888888888889 | 0 |
| 0.8645833333333334 | 0 |
| 0.8652777777777777 | 0 |
| 0.8659722222222223 | 0 |
| 0.8666666666666667 | 0 |
| 0.8673611111111111 | 0 |
| 0.8680555555555555 | 0 |
| 0.86875 | 0 |
| 0.8694444444444445 | 0 |
| 0.8701388888888889 | 0 |
| 0.8708333333333332 | 0 |
| 0.8715277777777778 | 0 |
| 0.8722222222222222 | 0 |
| 0.8729166666666667 | 0 |
| 0.873611111111111 | 0 |
| 0.8743055555555556 | 0 |
| 0.875 | 0 |
| 0.8756944444444444 | 0 |
| 0.876388888888889 | 0 |
| 0.8770833333333333 | 0 |
| 0.8777777777777778 | 0 |
| 0.8784722222222222 | 0 |
| 0.8791666666666668 | 0 |
| 0.8798611111111111 | 0 |
| 0.8805555555555555 | 0 |
| 0.88125 | 0 |
| 0.8819444444444445 | 0 |
| 0.8826388888888889 | 0 |
| 0.8833333333333333 | 0 |
| 0.8840277777777777 | 0 |
| 0.8847222222222223 | 0 |
| 0.8854166666666666 | 0 |
| 0.8861111111111111 | 0 |
| 0.8868055555555556 | 0 |
| 0.8875000000000001 | 0 |
| 0.8881944444444444 | 0 |
| 0.8888888888888888 | 0 |
| 0.8895833333333334 | 0 |
| 0.8902777777777778 | 0 |
| 0.8909722222222222 | 0 |
| 0.8916666666666666 | 0 |
| 0.8923611111111112 | 0 |
| 0.8930555555555556 | 0 |
| 0.8937499999999999 | 0 |
| 0.8944444444444444 | 0 |
| 0.8951388888888889 | 0 |
| 0.8958333333333334 | 0 |
| 0.8965277777777777 | 0 |
| 0.8972222222222223 | 0 |
| 0.8979166666666667 | 0 |
| 0.8986111111111111 | 0 |
| 0.8993055555555555 | 0 |
| 0.9 | 0 |
| 0.9006944444444445 | 0 |
| 0.9013888888888889 | 0 |
| 0.9020833333333332 | 0 |
| 0.9027777777777778 | 0 |
| 0.9034722222222222 | 0 |
| 0.9041666666666667 | 0 |
| 0.904861111111111 | 0 |
| 0.9055555555555556 | 0 |
| 0.90625 | 0 |
| 0.9069444444444444 | 0 |
| 0.907638888888889 | 0 |
| 0.9083333333333333 | 0 |
| 0.9090277777777778 | 0 |
| 0.9097222222222222 | 0 |
| 0.9104166666666668 | 0 |
| 0.9111111111111111 | 0 |
| 0.9118055555555555 | 0 |
| 0.9125 | 0 |
| 0.9131944444444445 | 0 |
| 0.9138888888888889 | 0 |
| 0.9145833333333333 | 0 |
| 0.9152777777777777 | 0 |
| 0.9159722222222223 | 0 |
| 0.9166666666666666 | 0 |
| 0.9173611111111111 | 0 |
| 0.9180555555555556 | 0 |
| 0.9187500000000001 | 0 |
| 0.9194444444444444 | 0 |
| 0.9201388888888888 | 0 |
| 0.9208333333333334 | 0 |
| 0.9215277777777778 | 0 |
| 0.9222222222222222 | 0 |
| 0.9229166666666666 | 0 |
| 0.9236111111111112 | 0 |
| 0.9243055555555556 | 0 |
| 0.9249999999999999 | 0 |
| 0.9256944444444444 | 0 |
| 0.9263888888888889 | 0 |
| 0.9270833333333334 | 0 |
| 0.9277777777777777 | 0 |
| 0.9284722222222223 | 0 |
| 0.9291666666666667 | 0 |
| 0.9298611111111111 | 0 |
| 0.9305555555555555 | 0 |
| 0.93125 | 0 |
| 0.9319444444444445 | 0 |
| 0.9326388888888889 | 0 |
| 0.9333333333333332 | 0 |
| 0.9340277777777778 | 0 |
| 0.9347222222222222 | 0 |
| 0.9354166666666667 | 0 |
| 0.936111111111111 | 0 |
| 0.9368055555555556 | 0 |
| 0.9375 | 0 |
| 0.9381944444444444 | 0 |
| 0.938888888888889 | 0 |
| 0.9395833333333333 | 0 |
| 0.9402777777777778 | 0 |
| 0.9409722222222222 | 0 |
| 0.9416666666666668 | 0 |
| 0.9423611111111111 | 0 |
| 0.9430555555555555 | 0 |
| 0.94375 | 0 |
| 0.9444444444444445 | 0 |
| 0.9451388888888889 | 0 |
| 0.9458333333333333 | 0 |
| 0.9465277777777777 | 0 |
| 0.9472222222222223 | 0 |
| 0.9479166666666666 | 0 |
| 0.9486111111111111 | 0 |
| 0.9493055555555556 | 0 |
| 0.9500000000000001 | 0 |
| 0.9506944444444444 | 0 |
| 0.9513888888888888 | 0 |
| 0.9520833333333334 | 0 |
| 0.9527777777777778 | 0 |
| 0.9534722222222222 | 0 |
| 0.9541666666666666 | 0 |
| 0.9548611111111112 | 0 |
| 0.9555555555555556 | 0 |
| 0.9562499999999999 | 0 |
| 0.9569444444444444 | 0 |
| 0.9576388888888889 | 0 |
| 0.9583333333333334 | 0 |
| 0.9590277777777777 | 0 |
| 0.9597222222222223 | 0 |
| 0.9604166666666667 | 0 |
| 0.9611111111111111 | 0 |
| 0.9618055555555555 | 0 |
| 0.9625 | 0 |
| 0.9631944444444445 | 0 |
| 0.9638888888888889 | 0 |
| 0.9645833333333332 | 0 |
| 0.9652777777777778 | 0 |
| 0.9659722222222222 | 0 |
| 0.9666666666666667 | 0 |
| 0.967361111111111 | 0 |
| 0.9680555555555556 | 0 |
| 0.96875 | 0 |
| 0.9694444444444444 | 0 |
| 0.970138888888889 | 0 |
| 0.9708333333333333 | 0 |
| 0.9715277777777778 | 0 |
| 0.9722222222222222 | 0 |
| 0.9729166666666668 | 0 |
| 0.9736111111111111 | 0 |
| 0.9743055555555555 | 0 |
| 0.975 | 0 |
| 0.9756944444444445 | 0 |
| 0.9763888888888889 | 0 |
| 0.9770833333333333 | 0 |
| 0.9777777777777777 | 0 |
| 0.9784722222222223 | 0 |
| 0.9791666666666666 | 0 |
| 0.9798611111111111 | 0 |
| 0.9805555555555556 | 0 |
| 0.9812500000000001 | 0 |
| 0.9819444444444444 | 0 |
| 0.9826388888888888 | 0 |
| 0.9833333333333334 | 0 |
| 0.9840277777777778 | 0 |
| 0.9847222222222222 | 0 |
| 0.9854166666666666 | 0 |
| 0.9861111111111112 | 0 |
| 0.9868055555555556 | 0 |
| 0.9874999999999999 | 0 |
| 0.9881944444444444 | 0 |
| 0.9888888888888889 | 0 |
| 0.9895833333333334 | 0 |
| 0.9902777777777777 | 0 |
| 0.9909722222222223 | 0 |
| 0.9916666666666667 | 0 |
| 0.9923611111111111 | 0 |
| 0.9930555555555555 | 0 |
| 0.99375 | 0 |
| 0.9944444444444445 | 0 |
| 0.9951388888888889 | 0 |
| 0.9958333333333332 | 0 |
| 0.9965277777777778 | 0 |
| 0.9972222222222222 | 0 |
| 0.9979166666666667 | 0 |
| 0.998611111111111 | 0 |
| 0.9993055555555556 | 0 |